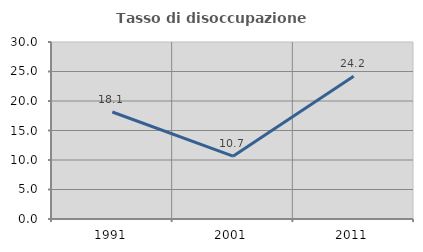
| Category | Tasso di disoccupazione giovanile  |
|---|---|
| 1991.0 | 18.13 |
| 2001.0 | 10.651 |
| 2011.0 | 24.214 |